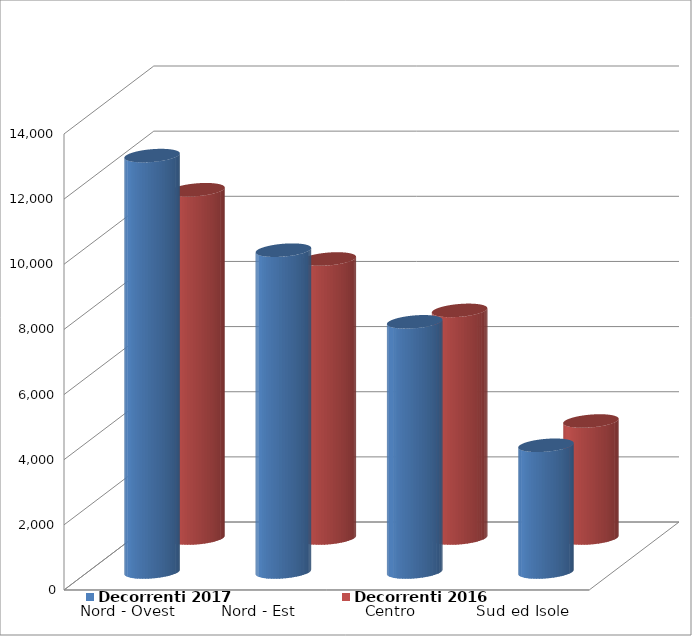
| Category | Decorrenti 2017 | Decorrenti 2016 |
|---|---|---|
| Nord - Ovest | 12783 | 10692 |
| Nord - Est | 9880 | 8566 |
| Centro | 7680 | 6988 |
| Sud ed Isole | 3890 | 3592 |